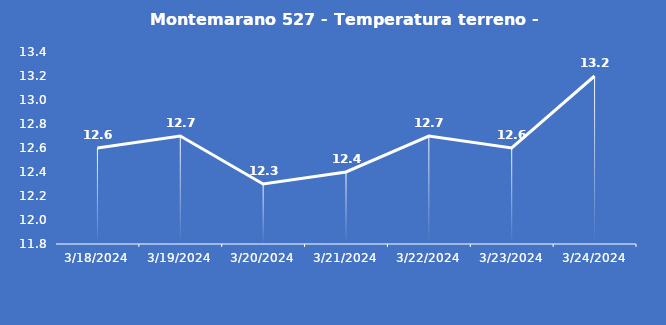
| Category | Montemarano 527 - Temperatura terreno - Grezzo (°C) |
|---|---|
| 3/18/24 | 12.6 |
| 3/19/24 | 12.7 |
| 3/20/24 | 12.3 |
| 3/21/24 | 12.4 |
| 3/22/24 | 12.7 |
| 3/23/24 | 12.6 |
| 3/24/24 | 13.2 |